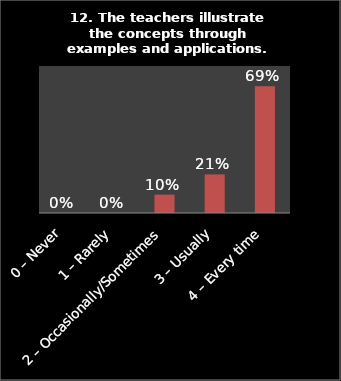
| Category | Series 0 |
|---|---|
| 0 – Never | 0 |
| 1 – Rarely | 0 |
| 2 – Occasionally/Sometimes | 0.1 |
| 3 – Usually | 0.21 |
| 4 – Every time | 0.69 |